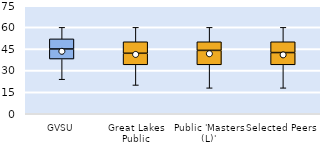
| Category | 25th | 50th | 75th |
|---|---|---|---|
| GVSU | 38 | 7 | 7 |
| Great Lakes Public | 34 | 8 | 8 |
| Public 'Masters (L)' | 34 | 10 | 6 |
| Selected Peers | 34 | 8.5 | 7.5 |